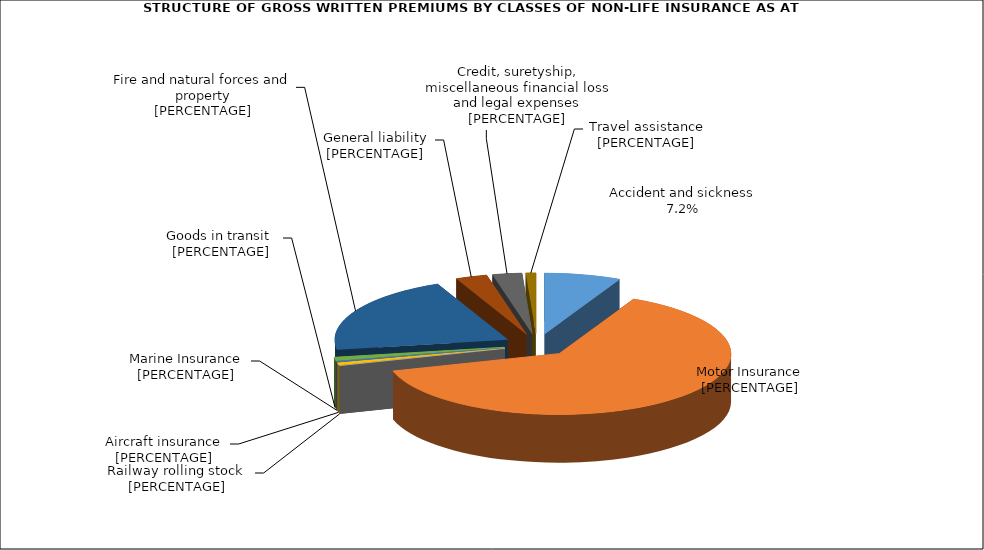
| Category | Злополука и заболяване |
|---|---|
| Злополука и заболяване | 0.072 |
| МПС | 0.632 |
| Релсови превозни средства | 0 |
| Летателни апарати | 0.007 |
| Плаванелни съдове | 0.003 |
| Товари по време на превоз | 0.01 |
| Пожар и природни бедствия и други щети на имущество | 0.21 |
| Обща гражданска отговорност | 0.03 |
| Кредити, гаранции, разни финансови загуби и правни разноски | 0.027 |
| Помощ при пътуване | 0.009 |